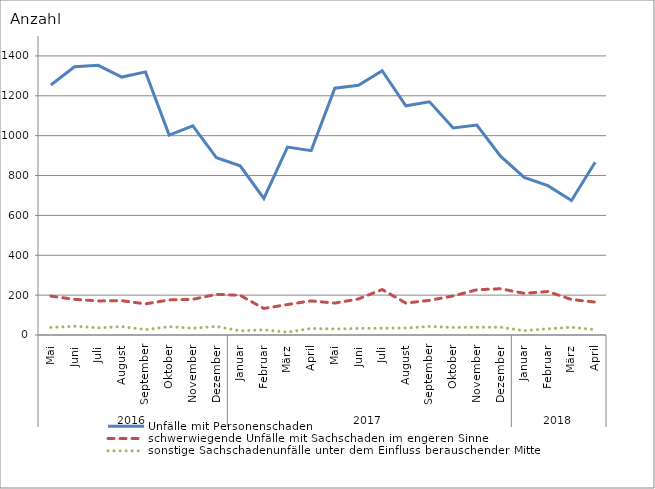
| Category | Unfälle mit Personenschaden | schwerwiegende Unfälle mit Sachschaden im engeren Sinne | sonstige Sachschadenunfälle unter dem Einfluss berauschender Mittel |
|---|---|---|---|
| 0 | 1254 | 195 | 38 |
| 1 | 1346 | 179 | 44 |
| 2 | 1353 | 171 | 36 |
| 3 | 1294 | 172 | 42 |
| 4 | 1320 | 156 | 27 |
| 5 | 1003 | 176 | 42 |
| 6 | 1049 | 179 | 34 |
| 7 | 889 | 204 | 43 |
| 8 | 849 | 199 | 21 |
| 9 | 685 | 133 | 26 |
| 10 | 943 | 153 | 14 |
| 11 | 925 | 171 | 33 |
| 12 | 1238 | 160 | 30 |
| 13 | 1253 | 181 | 33 |
| 14 | 1326 | 228 | 34 |
| 15 | 1150 | 160 | 35 |
| 16 | 1170 | 174 | 43 |
| 17 | 1039 | 196 | 38 |
| 18 | 1053 | 227 | 39 |
| 19 | 897 | 232 | 39 |
| 20 | 791 | 209 | 22 |
| 21 | 749 | 218 | 31 |
| 22 | 675 | 178 | 39 |
| 23 | 867 | 165 | 27 |